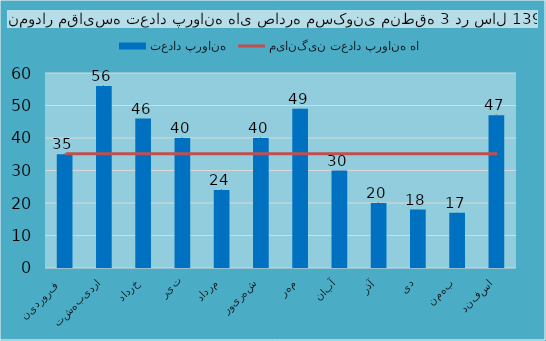
| Category | تعداد پروانه |
|---|---|
| فروردین  | 35 |
| اردیبهشت | 56 |
| خرداد | 46 |
| تیر | 40 |
| مرداد | 24 |
| شهریور | 40 |
| مهر | 49 |
| آبان | 30 |
| آذر | 20 |
| دی | 18 |
| بهمن | 17 |
| اسفند | 47 |